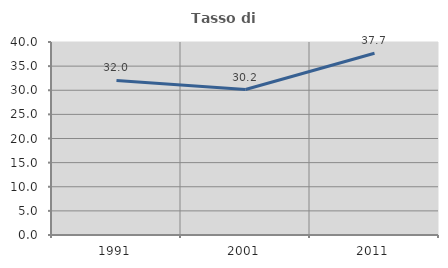
| Category | Tasso di occupazione   |
|---|---|
| 1991.0 | 32.023 |
| 2001.0 | 30.151 |
| 2011.0 | 37.661 |